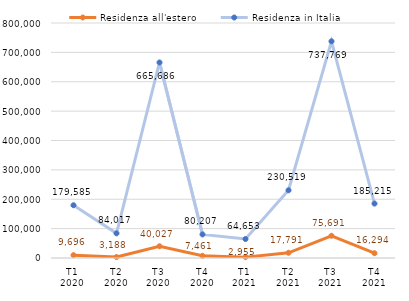
| Category | Residenza all'estero | Residenza in Italia |
|---|---|---|
| T1
2020 | 9696 | 179585 |
| T2
2020 | 3188 | 84017 |
| T3
2020 | 40027 | 665686 |
| T4
2020 | 7461 | 80207 |
| T1
2021 | 2955 | 64653 |
| T2
2021 | 17791 | 230519 |
| T3
2021 | 75691 | 737769 |
| T4
2021 | 16294 | 185215 |